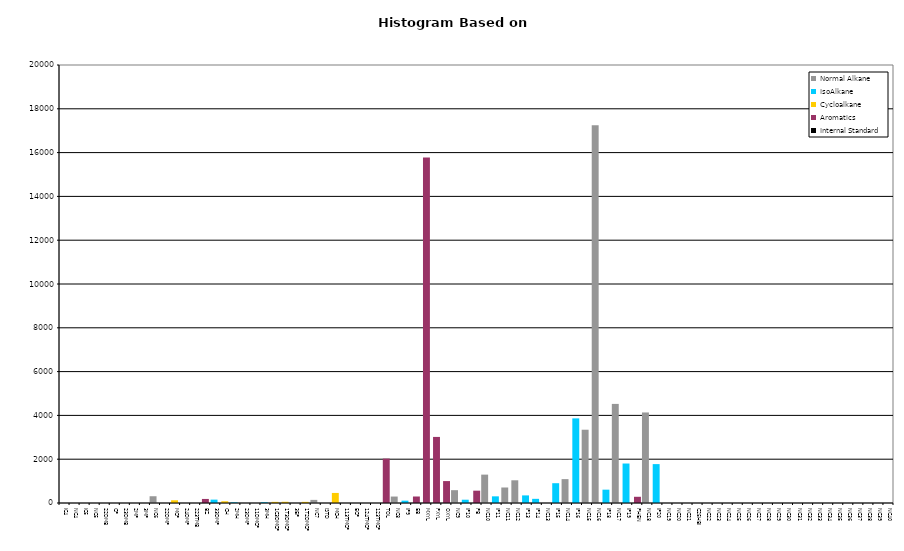
| Category | Normal Alkane | IsoAlkane | Cycloalkane | Aromatics | Internal Standard |
|---|---|---|---|---|---|
| IC4 | 0 | 0 | 0 | 0 | 0 |
| NC4 | 0 | 0 | 0 | 0 | 0 |
| IC5 | 0 | 0 | 0 | 0 | 0 |
| NC5 | 0 | 0 | 0 | 0 | 0 |
| 22DMB | 0 | 0 | 0 | 0 | 0 |
| CP | 0 | 0 | 0 | 0 | 0 |
| 23DMB | 0 | 0 | 0 | 0 | 0 |
| 2MP | 0 | 0 | 0 | 0 | 0 |
| 3MP | 0 | 0 | 0 | 0 | 0 |
| NC6 | 309 | 0 | 0 | 0 | 0 |
| 22DMP | 0 | 0 | 0 | 0 | 0 |
| MCP | 0 | 0 | 125 | 0 | 0 |
| 24DMP | 0 | 0 | 0 | 0 | 0 |
| 223TMB | 0 | 0 | 0 | 0 | 0 |
| BZ | 0 | 0 | 0 | 185 | 0 |
| 33DMP | 0 | 154 | 0 | 0 | 0 |
| CH | 0 | 0 | 79 | 0 | 0 |
| 2MH | 0 | 31 | 0 | 0 | 0 |
| 23DMP | 0 | 0 | 0 | 0 | 0 |
| 11DMCP | 0 | 0 | 0 | 0 | 0 |
| 3MH | 0 | 35 | 0 | 0 | 0 |
| 1C3DMCP | 0 | 0 | 52 | 0 | 0 |
| 1T3DMCP | 0 | 0 | 56 | 0 | 0 |
| 3EP | 0 | 0 | 0 | 0 | 0 |
| 1T2DMCP | 0 | 0 | 52 | 0 | 0 |
| NC7 | 142 | 0 | 0 | 0 | 0 |
| ISTD | 0 | 0 | 0 | 0 | 0 |
| MCH | 0 | 0 | 459 | 0 | 0 |
| 113TMCP | 0 | 0 | 0 | 0 | 0 |
| ECP | 0 | 0 | 0 | 0 | 0 |
| 124TMCP | 0 | 0 | 0 | 0 | 0 |
| 123TMCP | 0 | 0 | 0 | 0 | 0 |
| TOL | 0 | 0 | 0 | 2028 | 0 |
| NC8 | 295 | 0 | 0 | 0 | 0 |
| IP9 | 0 | 107 | 0 | 0 | 0 |
| EB | 0 | 0 | 0 | 297 | 0 |
| MXYL | 0 | 0 | 0 | 15781 | 0 |
| PXYL | 0 | 0 | 0 | 3017 | 0 |
| OXYL | 0 | 0 | 0 | 1001 | 0 |
| NC9 | 586 | 0 | 0 | 0 | 0 |
| IP10 | 0 | 150 | 0 | 0 | 0 |
| PB | 0 | 0 | 0 | 563 | 0 |
| NC10 | 1296 | 0 | 0 | 0 | 0 |
| IP11 | 0 | 304 | 0 | 0 | 0 |
| NC11 | 708 | 0 | 0 | 0 | 0 |
| NC12 | 1037 | 0 | 0 | 0 | 0 |
| IP13 | 0 | 347 | 0 | 0 | 0 |
| IP14 | 0 | 190 | 0 | 0 | 0 |
| NC13 | 0 | 0 | 0 | 0 | 0 |
| IP15 | 0 | 904 | 0 | 0 | 0 |
| NC14 | 1090 | 0 | 0 | 0 | 0 |
| IP16 | 0 | 3864 | 0 | 0 | 0 |
| NC15 | 3346 | 0 | 0 | 0 | 0 |
| NC16 | 17244 | 0 | 0 | 0 | 0 |
| IP18 | 0 | 609 | 0 | 0 | 0 |
| NC17 | 4525 | 0 | 0 | 0 | 0 |
| IP19 | 0 | 1803 | 0 | 0 | 0 |
| PHEN | 0 | 0 | 0 | 284 | 0 |
| NC18 | 4134 | 0 | 0 | 0 | 0 |
| IP20 | 0 | 1776 | 0 | 0 | 0 |
| NC19 | 0 | 0 | 0 | 0 | 0 |
| NC20 | 0 | 0 | 0 | 0 | 0 |
| NC21 | 0 | 0 | 0 | 0 | 0 |
| C25HBI | 0 | 0 | 0 | 0 | 0 |
| NC22 | 0 | 0 | 0 | 0 | 0 |
| NC23 | 0 | 0 | 0 | 0 | 0 |
| NC24 | 0 | 0 | 0 | 0 | 0 |
| NC25 | 0 | 0 | 0 | 0 | 0 |
| NC26 | 0 | 0 | 0 | 0 | 0 |
| NC27 | 0 | 0 | 0 | 0 | 0 |
| NC28 | 0 | 0 | 0 | 0 | 0 |
| NC29 | 0 | 0 | 0 | 0 | 0 |
| NC30 | 0 | 0 | 0 | 0 | 0 |
| NC31 | 0 | 0 | 0 | 0 | 0 |
| NC32 | 0 | 0 | 0 | 0 | 0 |
| NC33 | 0 | 0 | 0 | 0 | 0 |
| NC34 | 0 | 0 | 0 | 0 | 0 |
| NC35 | 0 | 0 | 0 | 0 | 0 |
| NC36 | 0 | 0 | 0 | 0 | 0 |
| NC37 | 0 | 0 | 0 | 0 | 0 |
| NC38 | 0 | 0 | 0 | 0 | 0 |
| NC39 | 0 | 0 | 0 | 0 | 0 |
| NC40 | 0 | 0 | 0 | 0 | 0 |